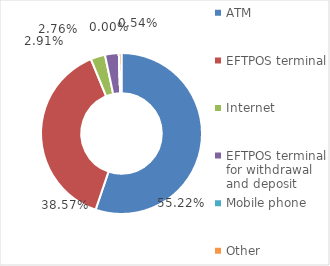
| Category | Value of transactions, in HRK |
|---|---|
| ATM | 92486107685 |
| EFTPOS terminal | 64586980991 |
| Internet | 4874489071 |
| EFTPOS terminal for withdrawal and deposit | 4621829250 |
| Mobile phone | 1453046 |
| Other | 900812942 |